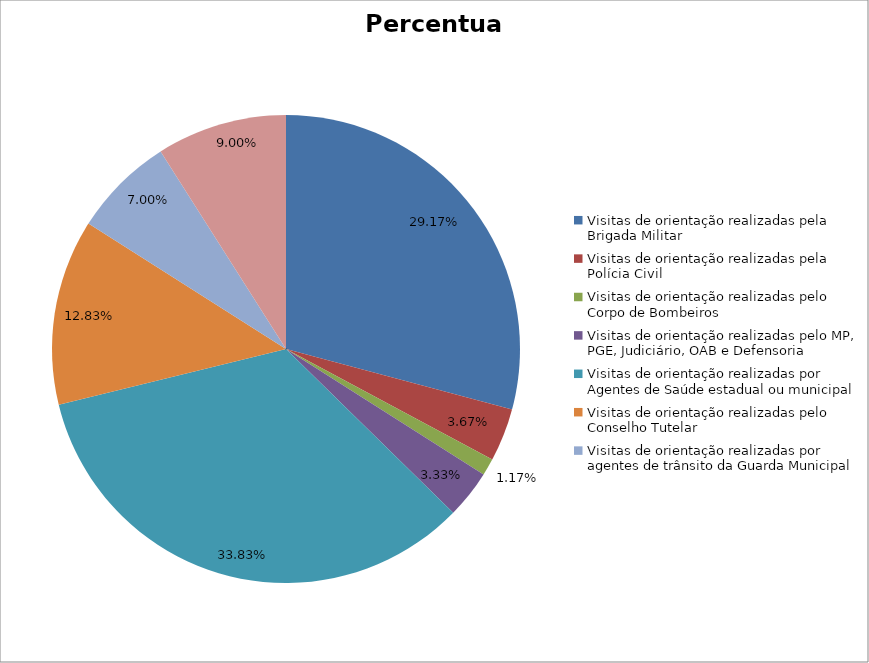
| Category | Percentual |
|---|---|
| Visitas de orientação realizadas pela Brigada Militar | 0.292 |
| Visitas de orientação realizadas pela Polícia Civil | 0.037 |
| Visitas de orientação realizadas pelo Corpo de Bombeiros | 0.012 |
| Visitas de orientação realizadas pelo MP, PGE, Judiciário, OAB e Defensoria | 0.033 |
| Visitas de orientação realizadas por Agentes de Saúde estadual ou municipal | 0.338 |
| Visitas de orientação realizadas pelo Conselho Tutelar | 0.128 |
| Visitas de orientação realizadas por agentes de trânsito da Guarda Municipal | 0.07 |
| Visitas de orientação realizadas por ONGs, entidades privadas, CRAS e CREAS | 0.09 |